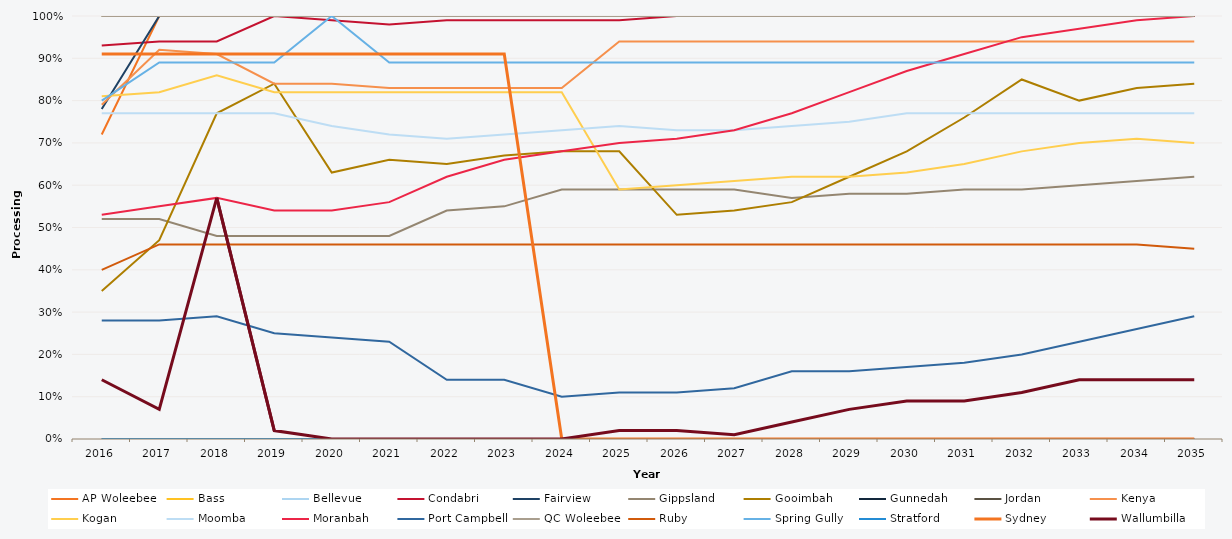
| Category | AP Woleebee | Bass | Bellevue | Condabri | Fairview | Gippsland | Gooimbah | Gunnedah | Jordan | Kenya | Kogan | Moomba | Moranbah | Port Campbell | QC Woleebee | Ruby | Spring Gully | Stratford | Sydney | Wallumbilla |
|---|---|---|---|---|---|---|---|---|---|---|---|---|---|---|---|---|---|---|---|---|
| 2016.0 | 0.72 | 1 | 1 | 0.93 | 0.78 | 0.52 | 0.35 | 0 | 1 | 0.79 | 0.81 | 0.77 | 0.53 | 0.28 | 1 | 0.4 | 0.8 | 0 | 0.91 | 0.14 |
| 2017.0 | 1 | 1 | 1 | 0.94 | 1 | 0.52 | 0.47 | 0 | 1 | 0.92 | 0.82 | 0.77 | 0.55 | 0.28 | 1 | 0.46 | 0.89 | 0 | 0.91 | 0.07 |
| 2018.0 | 1 | 1 | 1 | 0.94 | 1 | 0.48 | 0.77 | 0 | 1 | 0.91 | 0.86 | 0.77 | 0.57 | 0.29 | 1 | 0.46 | 0.89 | 0 | 0.91 | 0.57 |
| 2019.0 | 1 | 1 | 1 | 1 | 1 | 0.48 | 0.84 | 0 | 1 | 0.84 | 0.82 | 0.77 | 0.54 | 0.25 | 1 | 0.46 | 0.89 | 0 | 0.91 | 0.02 |
| 2020.0 | 1 | 1 | 1 | 0.99 | 1 | 0.48 | 0.63 | 0 | 1 | 0.84 | 0.82 | 0.74 | 0.54 | 0.24 | 1 | 0.46 | 1 | 0 | 0.91 | 0 |
| 2021.0 | 1 | 1 | 1 | 0.98 | 1 | 0.48 | 0.66 | 0 | 1 | 0.83 | 0.82 | 0.72 | 0.56 | 0.23 | 1 | 0.46 | 0.89 | 0 | 0.91 | 0 |
| 2022.0 | 1 | 1 | 1 | 0.99 | 1 | 0.54 | 0.65 | 0 | 1 | 0.83 | 0.82 | 0.71 | 0.62 | 0.14 | 1 | 0.46 | 0.89 | 0 | 0.91 | 0 |
| 2023.0 | 1 | 1 | 1 | 0.99 | 1 | 0.55 | 0.67 | 0 | 1 | 0.83 | 0.82 | 0.72 | 0.66 | 0.14 | 1 | 0.46 | 0.89 | 0 | 0.91 | 0 |
| 2024.0 | 1 | 1 | 1 | 0.99 | 1 | 0.59 | 0.68 | 0 | 1 | 0.83 | 0.82 | 0.73 | 0.68 | 0.1 | 1 | 0.46 | 0.89 | 0 | 0 | 0 |
| 2025.0 | 1 | 1 | 1 | 0.99 | 1 | 0.59 | 0.68 | 0 | 1 | 0.94 | 0.59 | 0.74 | 0.7 | 0.11 | 1 | 0.46 | 0.89 | 0 | 0 | 0.02 |
| 2026.0 | 1 | 1 | 1 | 1 | 1 | 0.59 | 0.53 | 0 | 1 | 0.94 | 0.6 | 0.73 | 0.71 | 0.11 | 1 | 0.46 | 0.89 | 0 | 0 | 0.02 |
| 2027.0 | 1 | 1 | 1 | 1 | 1 | 0.59 | 0.54 | 0 | 1 | 0.94 | 0.61 | 0.73 | 0.73 | 0.12 | 1 | 0.46 | 0.89 | 0 | 0 | 0.01 |
| 2028.0 | 1 | 1 | 1 | 1 | 1 | 0.57 | 0.56 | 0 | 1 | 0.94 | 0.62 | 0.74 | 0.77 | 0.16 | 1 | 0.46 | 0.89 | 0 | 0 | 0.04 |
| 2029.0 | 1 | 1 | 1 | 1 | 1 | 0.58 | 0.62 | 0 | 1 | 0.94 | 0.62 | 0.75 | 0.82 | 0.16 | 1 | 0.46 | 0.89 | 0 | 0 | 0.07 |
| 2030.0 | 1 | 1 | 1 | 1 | 1 | 0.58 | 0.68 | 0 | 1 | 0.94 | 0.63 | 0.77 | 0.87 | 0.17 | 1 | 0.46 | 0.89 | 0 | 0 | 0.09 |
| 2031.0 | 1 | 1 | 1 | 1 | 1 | 0.59 | 0.76 | 0 | 1 | 0.94 | 0.65 | 0.77 | 0.91 | 0.18 | 1 | 0.46 | 0.89 | 0 | 0 | 0.09 |
| 2032.0 | 1 | 1 | 1 | 1 | 1 | 0.59 | 0.85 | 0 | 1 | 0.94 | 0.68 | 0.77 | 0.95 | 0.2 | 1 | 0.46 | 0.89 | 0 | 0 | 0.11 |
| 2033.0 | 1 | 1 | 1 | 1 | 1 | 0.6 | 0.8 | 0 | 1 | 0.94 | 0.7 | 0.77 | 0.97 | 0.23 | 1 | 0.46 | 0.89 | 0 | 0 | 0.14 |
| 2034.0 | 1 | 1 | 1 | 1 | 1 | 0.61 | 0.83 | 0 | 1 | 0.94 | 0.71 | 0.77 | 0.99 | 0.26 | 1 | 0.46 | 0.89 | 0 | 0 | 0.14 |
| 2035.0 | 1 | 1 | 1 | 1 | 1 | 0.62 | 0.84 | 0 | 1 | 0.94 | 0.7 | 0.77 | 1 | 0.29 | 1 | 0.45 | 0.89 | 0 | 0 | 0.14 |